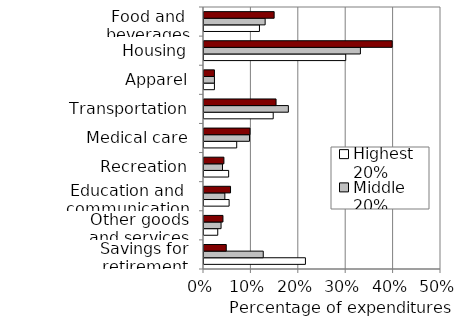
| Category | Highest 20% | Middle 20% | Lowest 20% |
|---|---|---|---|
| Savings for retirement | 0.214 | 0.125 | 0.047 |
| Other goods and services | 0.029 | 0.036 | 0.04 |
| Education and communication | 0.053 | 0.044 | 0.056 |
| Recreation | 0.052 | 0.039 | 0.042 |
| Medical care | 0.069 | 0.096 | 0.097 |
| Transportation | 0.146 | 0.178 | 0.152 |
| Apparel | 0.022 | 0.022 | 0.022 |
| Housing | 0.299 | 0.33 | 0.397 |
| Food and beverages | 0.117 | 0.129 | 0.148 |